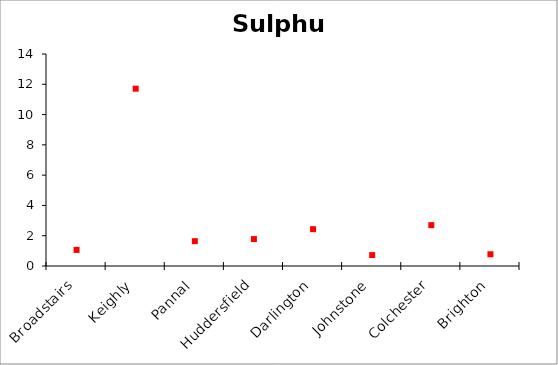
| Category | Sulphur | Series 1 | Series 2 |
|---|---|---|---|
| Broadstairs | 1.226 | 0.969 | 1.065 |
| Keighly | 11.79 | 11.61 | 11.71 |
| Pannal | 1.647 | 1.633 | 1.64 |
| Huddersfield | 1.786 | 1.773 | 1.777 |
| Darlington | 2.452 | 2.415 | 2.432 |
| Johnstone | 0.723 | 0.716 | 0.72 |
| Colchester | 2.795 | 2.598 | 2.698 |
| Brighton | 0.91 | 0.704 | 0.775 |